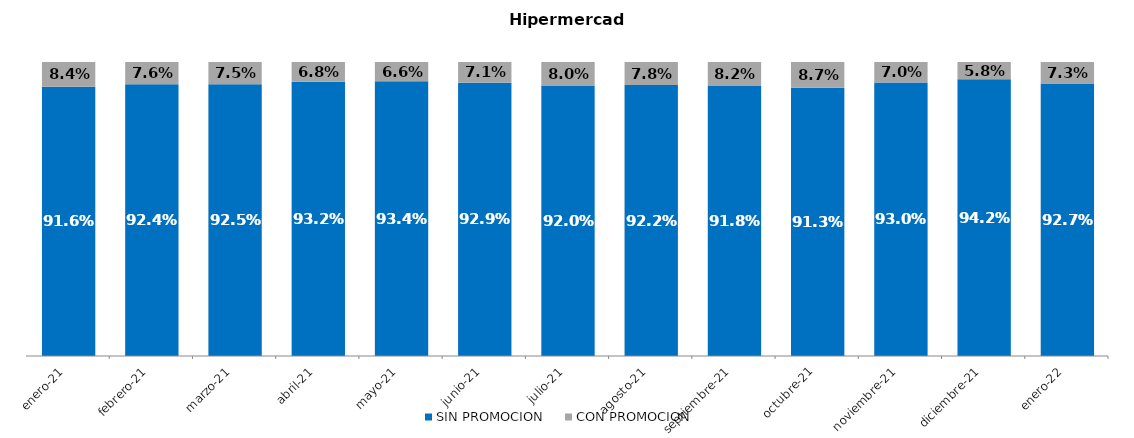
| Category | SIN PROMOCION   | CON PROMOCION   |
|---|---|---|
| 2021-01-01 | 0.916 | 0.084 |
| 2021-02-01 | 0.924 | 0.076 |
| 2021-03-01 | 0.925 | 0.075 |
| 2021-04-01 | 0.932 | 0.068 |
| 2021-05-01 | 0.934 | 0.066 |
| 2021-06-01 | 0.929 | 0.071 |
| 2021-07-01 | 0.92 | 0.08 |
| 2021-08-01 | 0.922 | 0.078 |
| 2021-09-01 | 0.918 | 0.082 |
| 2021-10-01 | 0.913 | 0.087 |
| 2021-11-01 | 0.93 | 0.07 |
| 2021-12-01 | 0.942 | 0.058 |
| 2022-01-01 | 0.927 | 0.073 |